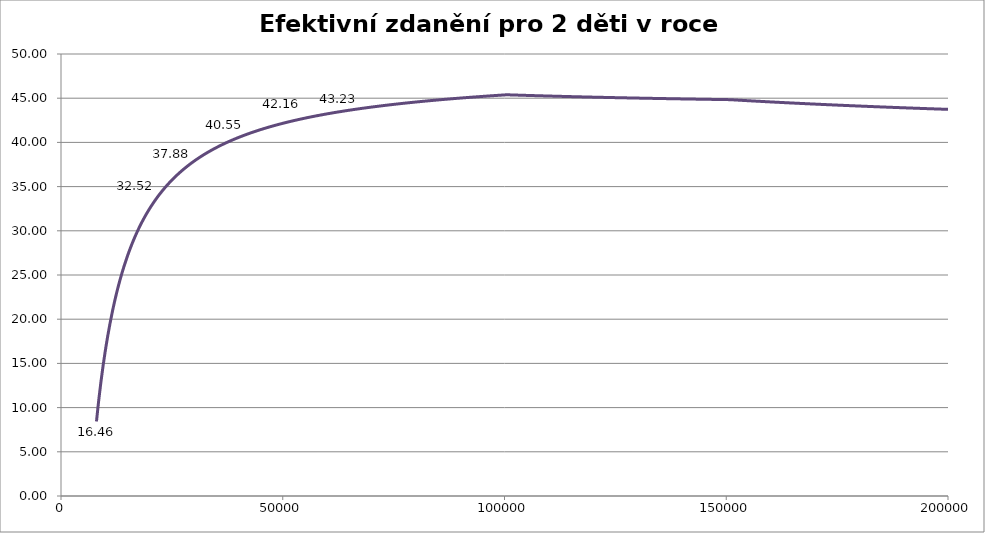
| Category | Efektivní zdanění 2012 |
|---|---|
| 8000.0 | 8.433 |
| 8500.0 | 10.795 |
| 9000.0 | 12.894 |
| 9500.0 | 14.772 |
| 10000.0 | 16.463 |
| 10500.0 | 17.992 |
| 11000.0 | 19.383 |
| 11500.0 | 20.652 |
| 12000.0 | 21.816 |
| 12500.0 | 22.887 |
| 13000.0 | 23.875 |
| 13500.0 | 24.79 |
| 14000.0 | 25.64 |
| 14500.0 | 26.431 |
| 15000.0 | 27.169 |
| 15500.0 | 27.86 |
| 16000.0 | 28.507 |
| 16500.0 | 29.116 |
| 17000.0 | 29.688 |
| 17500.0 | 30.228 |
| 18000.0 | 30.738 |
| 18500.0 | 31.22 |
| 19000.0 | 31.677 |
| 19500.0 | 32.111 |
| 20000.0 | 32.522 |
| 20500.0 | 32.914 |
| 21000.0 | 33.287 |
| 21500.0 | 33.643 |
| 22000.0 | 33.982 |
| 22500.0 | 34.307 |
| 23000.0 | 34.617 |
| 23500.0 | 34.914 |
| 24000.0 | 35.199 |
| 24500.0 | 35.472 |
| 25000.0 | 35.734 |
| 25500.0 | 35.986 |
| 26000.0 | 36.228 |
| 26500.0 | 36.462 |
| 27000.0 | 36.686 |
| 27500.0 | 36.902 |
| 28000.0 | 37.111 |
| 28500.0 | 37.312 |
| 29000.0 | 37.506 |
| 29500.0 | 37.694 |
| 30000.0 | 37.876 |
| 30500.0 | 38.051 |
| 31000.0 | 38.221 |
| 31500.0 | 38.385 |
| 32000.0 | 38.545 |
| 32500.0 | 38.699 |
| 33000.0 | 38.849 |
| 33500.0 | 38.994 |
| 34000.0 | 39.135 |
| 34500.0 | 39.272 |
| 35000.0 | 39.405 |
| 35500.0 | 39.534 |
| 36000.0 | 39.66 |
| 36500.0 | 39.782 |
| 37000.0 | 39.901 |
| 37500.0 | 40.017 |
| 38000.0 | 40.13 |
| 38500.0 | 40.239 |
| 39000.0 | 40.346 |
| 39500.0 | 40.451 |
| 40000.0 | 40.552 |
| 40500.0 | 40.651 |
| 41000.0 | 40.748 |
| 41500.0 | 40.842 |
| 42000.0 | 40.935 |
| 42500.0 | 41.025 |
| 43000.0 | 41.112 |
| 43500.0 | 41.198 |
| 44000.0 | 41.282 |
| 44500.0 | 41.364 |
| 45000.0 | 41.444 |
| 45500.0 | 41.523 |
| 46000.0 | 41.6 |
| 46500.0 | 41.675 |
| 47000.0 | 41.748 |
| 47500.0 | 41.82 |
| 48000.0 | 41.891 |
| 48500.0 | 41.96 |
| 49000.0 | 42.027 |
| 49500.0 | 42.093 |
| 50000.0 | 42.158 |
| 50500.0 | 42.222 |
| 51000.0 | 42.284 |
| 51500.0 | 42.345 |
| 52000.0 | 42.405 |
| 52500.0 | 42.464 |
| 53000.0 | 42.522 |
| 53500.0 | 42.578 |
| 54000.0 | 42.634 |
| 54500.0 | 42.689 |
| 55000.0 | 42.742 |
| 55500.0 | 42.795 |
| 56000.0 | 42.846 |
| 56500.0 | 42.897 |
| 57000.0 | 42.947 |
| 57500.0 | 42.996 |
| 58000.0 | 43.044 |
| 58500.0 | 43.092 |
| 59000.0 | 43.138 |
| 59500.0 | 43.184 |
| 60000.0 | 43.229 |
| 60500.0 | 43.273 |
| 61000.0 | 43.317 |
| 61500.0 | 43.359 |
| 62000.0 | 43.402 |
| 62500.0 | 43.443 |
| 63000.0 | 43.484 |
| 63500.0 | 43.524 |
| 64000.0 | 43.563 |
| 64500.0 | 43.602 |
| 65000.0 | 43.641 |
| 65500.0 | 43.678 |
| 66000.0 | 43.716 |
| 66500.0 | 43.752 |
| 67000.0 | 43.788 |
| 67500.0 | 43.824 |
| 68000.0 | 43.859 |
| 68500.0 | 43.893 |
| 69000.0 | 43.927 |
| 69500.0 | 43.961 |
| 70000.0 | 43.994 |
| 70500.0 | 44.026 |
| 71000.0 | 44.058 |
| 71500.0 | 44.09 |
| 72000.0 | 44.121 |
| 72500.0 | 44.152 |
| 73000.0 | 44.182 |
| 73500.0 | 44.212 |
| 74000.0 | 44.242 |
| 74500.0 | 44.271 |
| 75000.0 | 44.3 |
| 75500.0 | 44.328 |
| 76000.0 | 44.356 |
| 76500.0 | 44.383 |
| 77000.0 | 44.411 |
| 77500.0 | 44.438 |
| 78000.0 | 44.464 |
| 78500.0 | 44.49 |
| 79000.0 | 44.516 |
| 79500.0 | 44.542 |
| 80000.0 | 44.567 |
| 80500.0 | 44.592 |
| 81000.0 | 44.617 |
| 81500.0 | 44.641 |
| 82000.0 | 44.665 |
| 82500.0 | 44.689 |
| 83000.0 | 44.712 |
| 83500.0 | 44.735 |
| 84000.0 | 44.758 |
| 84500.0 | 44.781 |
| 85000.0 | 44.803 |
| 85500.0 | 44.825 |
| 86000.0 | 44.847 |
| 86500.0 | 44.869 |
| 87000.0 | 44.89 |
| 87500.0 | 44.911 |
| 88000.0 | 44.932 |
| 88500.0 | 44.953 |
| 89000.0 | 44.973 |
| 89500.0 | 44.993 |
| 90000.0 | 45.013 |
| 90500.0 | 45.033 |
| 91000.0 | 45.052 |
| 91500.0 | 45.072 |
| 92000.0 | 45.091 |
| 92500.0 | 45.11 |
| 93000.0 | 45.128 |
| 93500.0 | 45.147 |
| 94000.0 | 45.165 |
| 94500.0 | 45.183 |
| 95000.0 | 45.201 |
| 95500.0 | 45.219 |
| 96000.0 | 45.236 |
| 96500.0 | 45.254 |
| 97000.0 | 45.271 |
| 97500.0 | 45.288 |
| 98000.0 | 45.305 |
| 98500.0 | 45.321 |
| 99000.0 | 45.338 |
| 99500.0 | 45.354 |
| 100000.0 | 45.37 |
| 100500.0 | 45.388 |
| 101000.0 | 45.38 |
| 101500.0 | 45.372 |
| 102000.0 | 45.364 |
| 102500.0 | 45.356 |
| 103000.0 | 45.348 |
| 103500.0 | 45.34 |
| 104000.0 | 45.333 |
| 104500.0 | 45.325 |
| 105000.0 | 45.317 |
| 105500.0 | 45.31 |
| 106000.0 | 45.302 |
| 106500.0 | 45.295 |
| 107000.0 | 45.288 |
| 107500.0 | 45.281 |
| 108000.0 | 45.273 |
| 108500.0 | 45.266 |
| 109000.0 | 45.259 |
| 109500.0 | 45.252 |
| 110000.0 | 45.245 |
| 110500.0 | 45.238 |
| 111000.0 | 45.232 |
| 111500.0 | 45.225 |
| 112000.0 | 45.218 |
| 112500.0 | 45.212 |
| 113000.0 | 45.205 |
| 113500.0 | 45.199 |
| 114000.0 | 45.192 |
| 114500.0 | 45.186 |
| 115000.0 | 45.18 |
| 115500.0 | 45.173 |
| 116000.0 | 45.167 |
| 116500.0 | 45.161 |
| 117000.0 | 45.155 |
| 117500.0 | 45.149 |
| 118000.0 | 45.143 |
| 118500.0 | 45.137 |
| 119000.0 | 45.131 |
| 119500.0 | 45.125 |
| 120000.0 | 45.119 |
| 120500.0 | 45.113 |
| 121000.0 | 45.108 |
| 121500.0 | 45.102 |
| 122000.0 | 45.096 |
| 122500.0 | 45.091 |
| 123000.0 | 45.085 |
| 123500.0 | 45.08 |
| 124000.0 | 45.074 |
| 124500.0 | 45.069 |
| 125000.0 | 45.064 |
| 125500.0 | 45.058 |
| 126000.0 | 45.053 |
| 126500.0 | 45.048 |
| 127000.0 | 45.043 |
| 127500.0 | 45.038 |
| 128000.0 | 45.032 |
| 128500.0 | 45.027 |
| 129000.0 | 45.022 |
| 129500.0 | 45.017 |
| 130000.0 | 45.012 |
| 130500.0 | 45.008 |
| 131000.0 | 45.003 |
| 131500.0 | 44.998 |
| 132000.0 | 44.993 |
| 132500.0 | 44.988 |
| 133000.0 | 44.984 |
| 133500.0 | 44.979 |
| 134000.0 | 44.974 |
| 134500.0 | 44.97 |
| 135000.0 | 44.965 |
| 135500.0 | 44.96 |
| 136000.0 | 44.956 |
| 136500.0 | 44.951 |
| 137000.0 | 44.947 |
| 137500.0 | 44.943 |
| 138000.0 | 44.938 |
| 138500.0 | 44.934 |
| 139000.0 | 44.929 |
| 139500.0 | 44.925 |
| 140000.0 | 44.921 |
| 140500.0 | 44.917 |
| 141000.0 | 44.912 |
| 141500.0 | 44.908 |
| 142000.0 | 44.904 |
| 142500.0 | 44.9 |
| 143000.0 | 44.896 |
| 143500.0 | 44.892 |
| 144000.0 | 44.888 |
| 144500.0 | 44.884 |
| 145000.0 | 44.88 |
| 145500.0 | 44.876 |
| 146000.0 | 44.872 |
| 146500.0 | 44.868 |
| 147000.0 | 44.864 |
| 147500.0 | 44.86 |
| 148000.0 | 44.857 |
| 148500.0 | 44.853 |
| 149000.0 | 44.849 |
| 149500.0 | 44.845 |
| 150000.0 | 44.842 |
| 150500.0 | 44.838 |
| 151000.0 | 44.83 |
| 151500.0 | 44.816 |
| 152000.0 | 44.801 |
| 152500.0 | 44.786 |
| 153000.0 | 44.772 |
| 153500.0 | 44.758 |
| 154000.0 | 44.743 |
| 154500.0 | 44.729 |
| 155000.0 | 44.715 |
| 155500.0 | 44.701 |
| 156000.0 | 44.687 |
| 156500.0 | 44.674 |
| 157000.0 | 44.66 |
| 157500.0 | 44.646 |
| 158000.0 | 44.633 |
| 158500.0 | 44.619 |
| 159000.0 | 44.606 |
| 159500.0 | 44.593 |
| 160000.0 | 44.58 |
| 160500.0 | 44.566 |
| 161000.0 | 44.553 |
| 161500.0 | 44.541 |
| 162000.0 | 44.528 |
| 162500.0 | 44.515 |
| 163000.0 | 44.502 |
| 163500.0 | 44.49 |
| 164000.0 | 44.477 |
| 164500.0 | 44.465 |
| 165000.0 | 44.452 |
| 165500.0 | 44.44 |
| 166000.0 | 44.428 |
| 166500.0 | 44.415 |
| 167000.0 | 44.403 |
| 167500.0 | 44.391 |
| 168000.0 | 44.379 |
| 168500.0 | 44.367 |
| 169000.0 | 44.356 |
| 169500.0 | 44.344 |
| 170000.0 | 44.332 |
| 170500.0 | 44.321 |
| 171000.0 | 44.309 |
| 171500.0 | 44.298 |
| 172000.0 | 44.286 |
| 172500.0 | 44.275 |
| 173000.0 | 44.263 |
| 173500.0 | 44.252 |
| 174000.0 | 44.241 |
| 174500.0 | 44.23 |
| 175000.0 | 44.219 |
| 175500.0 | 44.208 |
| 176000.0 | 44.197 |
| 176500.0 | 44.186 |
| 177000.0 | 44.176 |
| 177500.0 | 44.165 |
| 178000.0 | 44.154 |
| 178500.0 | 44.144 |
| 179000.0 | 44.133 |
| 179500.0 | 44.123 |
| 180000.0 | 44.112 |
| 180500.0 | 44.102 |
| 181000.0 | 44.092 |
| 181500.0 | 44.081 |
| 182000.0 | 44.071 |
| 182500.0 | 44.061 |
| 183000.0 | 44.051 |
| 183500.0 | 44.041 |
| 184000.0 | 44.031 |
| 184500.0 | 44.021 |
| 185000.0 | 44.011 |
| 185500.0 | 44.001 |
| 186000.0 | 43.992 |
| 186500.0 | 43.982 |
| 187000.0 | 43.972 |
| 187500.0 | 43.963 |
| 188000.0 | 43.953 |
| 188500.0 | 43.944 |
| 189000.0 | 43.934 |
| 189500.0 | 43.925 |
| 190000.0 | 43.915 |
| 190500.0 | 43.906 |
| 191000.0 | 43.897 |
| 191500.0 | 43.888 |
| 192000.0 | 43.879 |
| 192500.0 | 43.869 |
| 193000.0 | 43.86 |
| 193500.0 | 43.851 |
| 194000.0 | 43.842 |
| 194500.0 | 43.833 |
| 195000.0 | 43.825 |
| 195500.0 | 43.816 |
| 196000.0 | 43.807 |
| 196500.0 | 43.798 |
| 197000.0 | 43.79 |
| 197500.0 | 43.781 |
| 198000.0 | 43.772 |
| 198500.0 | 43.764 |
| 199000.0 | 43.755 |
| 199500.0 | 43.747 |
| 200000.0 | 43.738 |